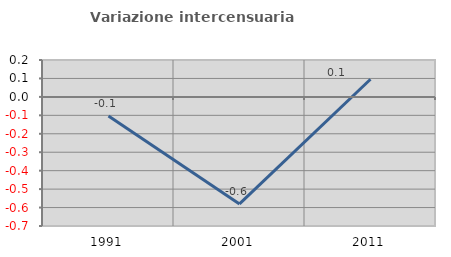
| Category | Variazione intercensuaria annua |
|---|---|
| 1991.0 | -0.103 |
| 2001.0 | -0.58 |
| 2011.0 | 0.096 |